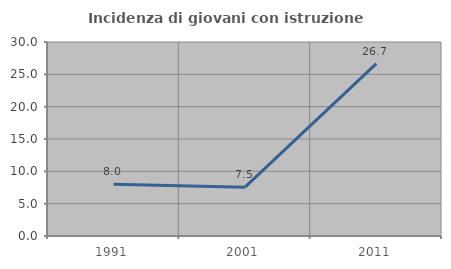
| Category | Incidenza di giovani con istruzione universitaria |
|---|---|
| 1991.0 | 8 |
| 2001.0 | 7.547 |
| 2011.0 | 26.667 |